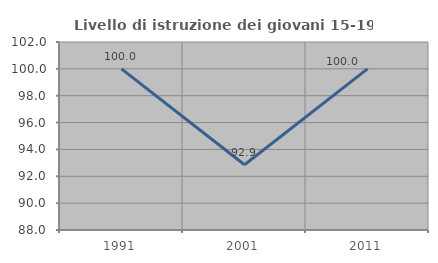
| Category | Livello di istruzione dei giovani 15-19 anni |
|---|---|
| 1991.0 | 100 |
| 2001.0 | 92.857 |
| 2011.0 | 100 |